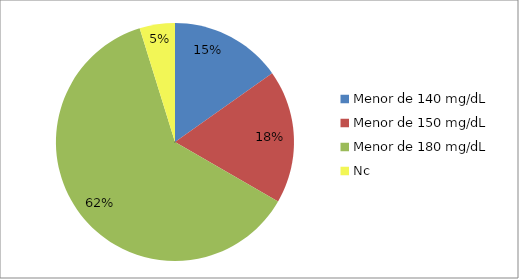
| Category | Series 0 | Series 1 | Series 2 |
|---|---|---|---|
| Menor de 140 mg/dL |  |  | 57 |
| Menor de 150 mg/dL |  |  | 68 |
| Menor de 180 mg/dL |  |  | 232 |
| Nc |  |  | 18 |